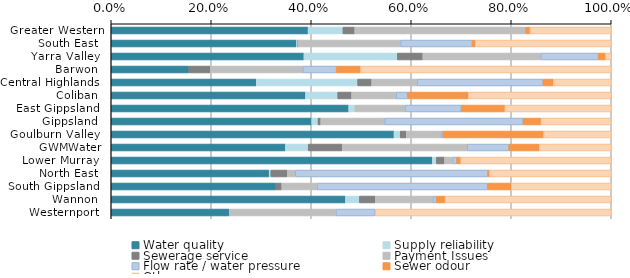
| Category | Water quality | Supply reliability | Sewerage service | Payment Issues | Flow rate / water pressure | Sewer odour | Other |
|---|---|---|---|---|---|---|---|
| Greater Western | 0.394 | 0.07 | 0.023 | 0.341 | 0.002 | 0.007 | 0.162 |
| South East  | 0.371 | 0.003 | 0.001 | 0.205 | 0.143 | 0.006 | 0.272 |
| Yarra Valley  | 0.385 | 0.187 | 0.051 | 0.236 | 0.115 | 0.014 | 0.011 |
| Barwon  | 0.155 | 0 | 0.043 | 0.185 | 0.068 | 0.048 | 0.501 |
| Central Highlands  | 0.29 | 0.203 | 0.028 | 0.091 | 0.252 | 0.021 | 0.115 |
| Coliban  | 0.389 | 0.065 | 0.028 | 0.089 | 0.023 | 0.121 | 0.286 |
| East Gippsland  | 0.475 | 0.012 | 0 | 0.1 | 0.112 | 0.088 | 0.212 |
| Gippsland  | 0.401 | 0.013 | 0.005 | 0.128 | 0.277 | 0.036 | 0.14 |
| Goulburn Valley  | 0.566 | 0.012 | 0.012 | 0.07 | 0.004 | 0.201 | 0.135 |
| GWMWater | 0.348 | 0.045 | 0.068 | 0.25 | 0.083 | 0.061 | 0.144 |
| Lower Murray  | 0.642 | 0.008 | 0.016 | 0.016 | 0.008 | 0.008 | 0.301 |
| North East  | 0.316 | 0.003 | 0.033 | 0.016 | 0.385 | 0.003 | 0.243 |
| South Gippsland  | 0.329 | 0 | 0.012 | 0.071 | 0.341 | 0.047 | 0.2 |
| Wannon  | 0.469 | 0.028 | 0.031 | 0.115 | 0.007 | 0.017 | 0.332 |
| Westernport  | 0.236 | 0 | 0 | 0.213 | 0.079 | 0 | 0.472 |